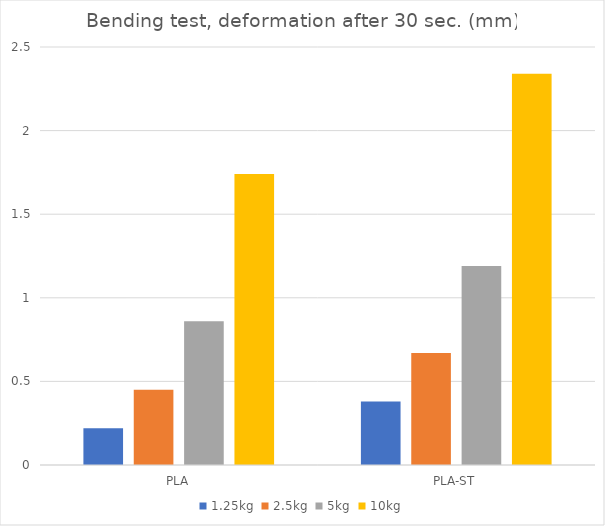
| Category | 1.25kg | 2.5kg | 5kg | 10kg |
|---|---|---|---|---|
| PLA | 0.22 | 0.45 | 0.86 | 1.74 |
| PLA-ST | 0.38 | 0.67 | 1.19 | 2.34 |